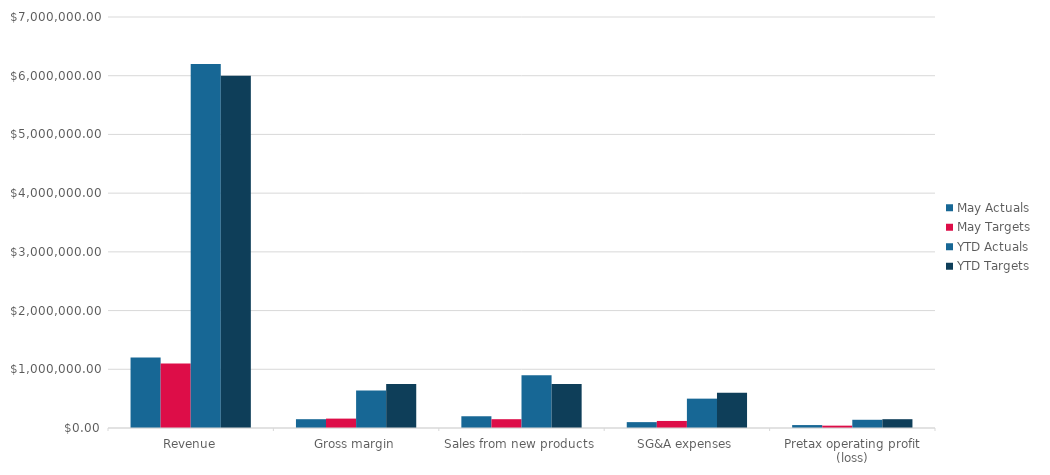
| Category | May Actuals | May Targets | YTD Actuals | YTD Targets |
|---|---|---|---|---|
| Revenue | 1200000 | 1100000 | 6200000 | 6000000 |
| Gross margin | 150000 | 160000 | 640000 | 750000 |
| Sales from new products | 200000 | 150000 | 900000 | 750000 |
| SG&A expenses | 100000 | 120000 | 500000 | 600000 |
| Pretax operating profit (loss) | 50000 | 40000 | 140000 | 150000 |